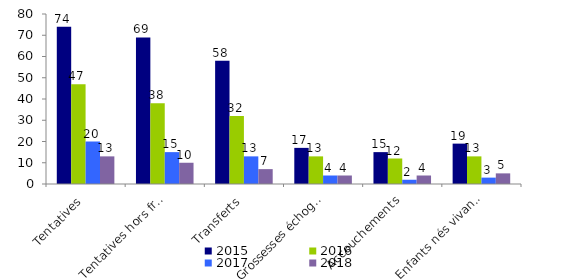
| Category | 2015 | 2016 | 2017 | 2018 |
|---|---|---|---|---|
| Tentatives | 74 | 47 | 20 | 13 |
| Tentatives hors freeze-all* | 69 | 38 | 15 | 10 |
| Transferts | 58 | 32 | 13 | 7 |
| Grossesses échographiques | 17 | 13 | 4 | 4 |
| Accouchements | 15 | 12 | 2 | 4 |
| Enfants nés vivants | 19 | 13 | 3 | 5 |